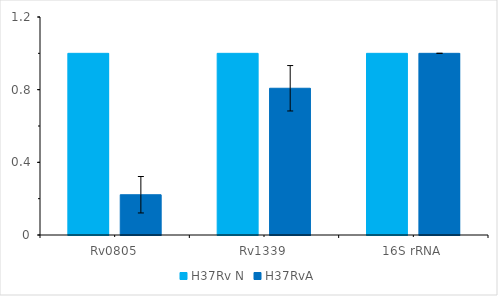
| Category | H37Rv N | H37RvA |
|---|---|---|
| Rv0805 | 1 | 0.222 |
| Rv1339 | 1 | 0.808 |
| 16S rRNA | 1 | 1 |